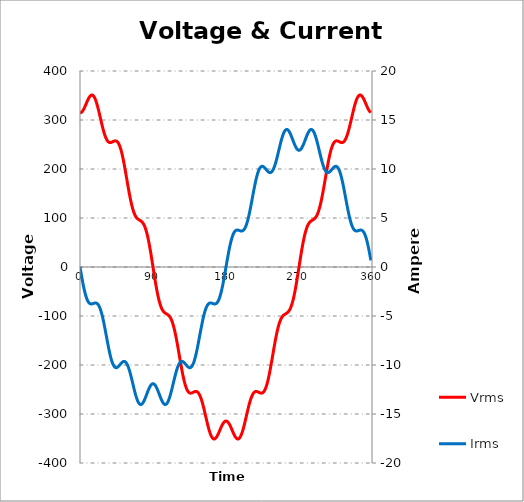
| Category | Vrms |
|---|---|
| 0.0 | 314.351 |
| 1.40625 | 315.136 |
| 2.8125 | 317.428 |
| 4.21875 | 321.038 |
| 5.625 | 325.668 |
| 7.03125 | 330.931 |
| 8.4375 | 336.38 |
| 9.84375 | 341.541 |
| 11.25 | 345.944 |
| 12.65625 | 349.161 |
| 14.0625 | 350.834 |
| 15.46875 | 350.706 |
| 16.875 | 348.632 |
| 18.28125 | 344.597 |
| 19.6875 | 338.713 |
| 21.09375 | 331.211 |
| 22.5 | 322.427 |
| 23.90625 | 312.775 |
| 25.3125 | 302.719 |
| 26.71875 | 292.739 |
| 28.125 | 283.296 |
| 29.53125 | 274.799 |
| 30.9375 | 267.575 |
| 32.34375 | 261.847 |
| 33.75 | 257.716 |
| 35.15625 | 255.156 |
| 36.5625 | 254.014 |
| 37.96875 | 254.023 |
| 39.375 | 254.821 |
| 40.78125 | 255.976 |
| 42.1875 | 257.02 |
| 43.59375 | 257.482 |
| 45.0 | 256.921 |
| 46.40625 | 254.961 |
| 47.8125 | 251.316 |
| 49.21875 | 245.813 |
| 50.625 | 238.402 |
| 52.03125 | 229.163 |
| 53.4375 | 218.3 |
| 54.84375 | 206.124 |
| 56.25 | 193.032 |
| 57.65625 | 179.48 |
| 59.0625 | 165.95 |
| 60.46875 | 152.912 |
| 61.875 | 140.796 |
| 63.28125 | 129.956 |
| 64.6875 | 120.646 |
| 66.09375 | 113.004 |
| 67.5 | 107.04 |
| 68.90625 | 102.639 |
| 70.3125 | 99.562 |
| 71.71875 | 97.474 |
| 73.125 | 95.961 |
| 74.53125 | 94.562 |
| 75.9375 | 92.806 |
| 77.34375 | 90.241 |
| 78.75 | 86.472 |
| 80.15625 | 81.188 |
| 81.5625 | 74.184 |
| 82.96875 | 65.378 |
| 84.375 | 54.815 |
| 85.78125 | 42.667 |
| 87.1875 | 29.219 |
| 88.59375 | 14.849 |
| 90.0 | 0 |
| 91.40625 | -14.849 |
| 92.8125 | -29.219 |
| 94.21875 | -42.667 |
| 95.625 | -54.815 |
| 97.03125 | -65.378 |
| 98.4375 | -74.184 |
| 99.84375 | -81.188 |
| 101.25 | -86.472 |
| 102.65625 | -90.241 |
| 104.0625 | -92.806 |
| 105.46875 | -94.562 |
| 106.875 | -95.961 |
| 108.28125 | -97.474 |
| 109.6875 | -99.562 |
| 111.09375 | -102.639 |
| 112.5 | -107.04 |
| 113.90625 | -113.004 |
| 115.3125 | -120.646 |
| 116.71875 | -129.956 |
| 118.125 | -140.796 |
| 119.53125 | -152.912 |
| 120.9375 | -165.95 |
| 122.34375 | -179.48 |
| 123.75 | -193.032 |
| 125.15625 | -206.124 |
| 126.5625 | -218.3 |
| 127.96875 | -229.163 |
| 129.375 | -238.402 |
| 130.78125 | -245.813 |
| 132.1875 | -251.316 |
| 133.59375 | -254.961 |
| 135.0 | -256.921 |
| 136.40625 | -257.482 |
| 137.8125 | -257.02 |
| 139.21875 | -255.976 |
| 140.625 | -254.821 |
| 142.03125 | -254.023 |
| 143.4375 | -254.014 |
| 144.84375 | -255.156 |
| 146.25 | -257.716 |
| 147.65625 | -261.847 |
| 149.0625 | -267.575 |
| 150.46875 | -274.799 |
| 151.875 | -283.296 |
| 153.28125 | -292.739 |
| 154.6875 | -302.719 |
| 156.09375 | -312.775 |
| 157.5 | -322.427 |
| 158.90625 | -331.211 |
| 160.3125 | -338.713 |
| 161.71875 | -344.597 |
| 163.125 | -348.632 |
| 164.53125 | -350.706 |
| 165.9375 | -350.834 |
| 167.34375 | -349.161 |
| 168.75 | -345.944 |
| 170.15625 | -341.541 |
| 171.5625 | -336.38 |
| 172.96875 | -330.931 |
| 174.375 | -325.668 |
| 175.78125 | -321.038 |
| 177.1875 | -317.428 |
| 178.59375 | -315.136 |
| 180.0 | -314.351 |
| 181.40625 | -315.136 |
| 182.8125 | -317.428 |
| 184.21875 | -321.038 |
| 185.625 | -325.668 |
| 187.03125 | -330.931 |
| 188.4375 | -336.38 |
| 189.84375 | -341.541 |
| 191.25 | -345.944 |
| 192.65625 | -349.161 |
| 194.0625 | -350.834 |
| 195.46875 | -350.706 |
| 196.875 | -348.632 |
| 198.28125 | -344.597 |
| 199.6875 | -338.713 |
| 201.09375 | -331.211 |
| 202.5 | -322.427 |
| 203.90625 | -312.775 |
| 205.3125 | -302.719 |
| 206.71875 | -292.739 |
| 208.125 | -283.296 |
| 209.53125 | -274.799 |
| 210.9375 | -267.575 |
| 212.34375 | -261.847 |
| 213.75 | -257.716 |
| 215.15625 | -255.156 |
| 216.5625 | -254.014 |
| 217.96875 | -254.023 |
| 219.375 | -254.821 |
| 220.78125 | -255.976 |
| 222.1875 | -257.02 |
| 223.59375 | -257.482 |
| 225.0 | -256.921 |
| 226.40625 | -254.961 |
| 227.8125 | -251.316 |
| 229.21875 | -245.813 |
| 230.625 | -238.402 |
| 232.03125 | -229.163 |
| 233.4375 | -218.3 |
| 234.84375 | -206.124 |
| 236.25 | -193.032 |
| 237.65625 | -179.48 |
| 239.0625 | -165.95 |
| 240.46875 | -152.912 |
| 241.875 | -140.796 |
| 243.28125 | -129.956 |
| 244.6875 | -120.646 |
| 246.09375 | -113.004 |
| 247.5 | -107.04 |
| 248.90625 | -102.639 |
| 250.3125 | -99.562 |
| 251.71875 | -97.474 |
| 253.125 | -95.961 |
| 254.53125 | -94.562 |
| 255.9375 | -92.806 |
| 257.34375 | -90.241 |
| 258.75 | -86.472 |
| 260.15625 | -81.188 |
| 261.5625 | -74.184 |
| 262.96875 | -65.378 |
| 264.375 | -54.815 |
| 265.78125 | -42.667 |
| 267.1875 | -29.219 |
| 268.59375 | -14.849 |
| 270.0 | 0 |
| 271.40625 | 14.849 |
| 272.8125 | 29.219 |
| 274.21875 | 42.667 |
| 275.625 | 54.815 |
| 277.03125 | 65.378 |
| 278.4375 | 74.184 |
| 279.84375 | 81.188 |
| 281.25 | 86.472 |
| 282.65625 | 90.241 |
| 284.0625 | 92.806 |
| 285.46875 | 94.562 |
| 286.875 | 95.961 |
| 288.28125 | 97.474 |
| 289.6875 | 99.562 |
| 291.09375 | 102.639 |
| 292.5 | 107.04 |
| 293.90625 | 113.004 |
| 295.3125 | 120.646 |
| 296.71875 | 129.956 |
| 298.125 | 140.796 |
| 299.53125 | 152.912 |
| 300.9375 | 165.95 |
| 302.34375 | 179.48 |
| 303.75 | 193.032 |
| 305.15625 | 206.124 |
| 306.5625 | 218.3 |
| 307.96875 | 229.163 |
| 309.375 | 238.402 |
| 310.78125 | 245.813 |
| 312.1875 | 251.316 |
| 313.59375 | 254.961 |
| 315.0 | 256.921 |
| 316.40625 | 257.482 |
| 317.8125 | 257.02 |
| 319.21875 | 255.976 |
| 320.625 | 254.821 |
| 322.03125 | 254.023 |
| 323.4375 | 254.014 |
| 324.84375 | 255.156 |
| 326.25 | 257.716 |
| 327.65625 | 261.847 |
| 329.0625 | 267.575 |
| 330.46875 | 274.799 |
| 331.875 | 283.296 |
| 333.28125 | 292.739 |
| 334.6875 | 302.719 |
| 336.09375 | 312.775 |
| 337.5 | 322.427 |
| 338.90625 | 331.211 |
| 340.3125 | 338.713 |
| 341.71875 | 344.597 |
| 343.125 | 348.632 |
| 344.53125 | 350.706 |
| 345.9375 | 350.834 |
| 347.34375 | 349.161 |
| 348.75 | 345.944 |
| 350.15625 | 341.541 |
| 351.5625 | 336.38 |
| 352.96875 | 330.931 |
| 354.375 | 325.668 |
| 355.78125 | 321.038 |
| 357.1875 | 317.428 |
| 358.59375 | 315.136 |